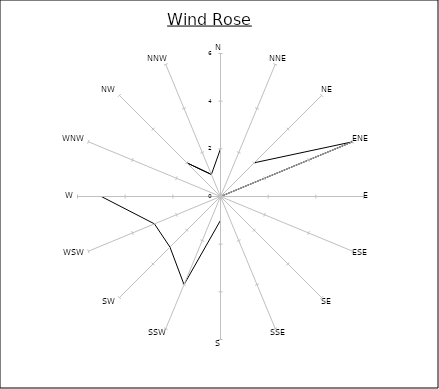
| Category | Series 0 |
|---|---|
| N | 2 |
| NNE | 0 |
| NE | 2 |
| ENE | 6 |
| E | 0 |
| ESE | 0 |
| SE | 1 |
| SSE | 0 |
| S | 1 |
| SSW | 4 |
| SW | 3 |
| WSW | 3 |
| W | 5 |
| WNW | 0 |
| NW | 2 |
| NNW | 1 |